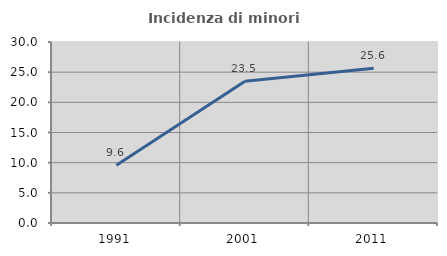
| Category | Incidenza di minori stranieri |
|---|---|
| 1991.0 | 9.589 |
| 2001.0 | 23.487 |
| 2011.0 | 25.645 |